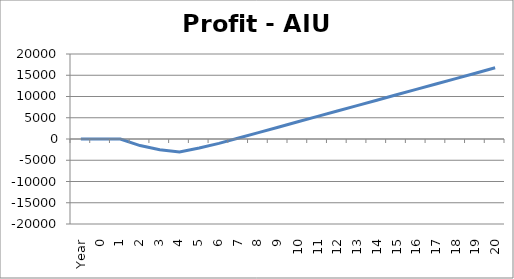
| Category | Accum |
|---|---|
| Year | 0 |
| 0 | 0 |
| 1 | 0 |
| 2 | -1546.475 |
| 3 | -2543.139 |
| 4 | -3063.796 |
| 5 | -2119.373 |
| 6 | -1039.507 |
| 7 | 231.151 |
| 8 | 1501.81 |
| 9 | 2772.468 |
| 10 | 4043.127 |
| 11 | 5313.785 |
| 12 | 6584.443 |
| 13 | 7855.102 |
| 14 | 9125.76 |
| 15 | 10396.419 |
| 16 | 11667.077 |
| 17 | 12937.736 |
| 18 | 14208.394 |
| 19 | 15479.052 |
| 20 | 16749.711 |